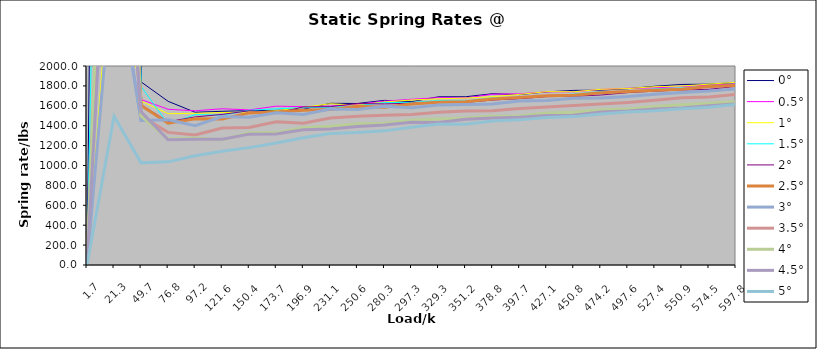
| Category | 0° | 0.5° | 1° | 1.5° | 2° | 2.5° | 3° | 3.5° | 4° | 4.5° | 5° |
|---|---|---|---|---|---|---|---|---|---|---|---|
| 1.7 | 0 | 0 | 0 | 0 | 0 | 0 | 0 | 0 | 0 | 0 | 0 |
| 21.3 | 23813.4 | 6905.294 | 3545.657 | 13416 | 6266.684 | 6583.778 | 3146 | 5723.095 | 7036.824 | 4968.889 | 1495.506 |
| 49.7 | 1839.887 | 1663.282 | 1647.75 | 1793.915 | 1611.419 | 1602.878 | 1451.547 | 1494.717 | 1497.425 | 1540.161 | 1026.527 |
| 76.8 | 1644.874 | 1564.777 | 1520.72 | 1415.34 | 1439.907 | 1424.976 | 1459.611 | 1332.616 | 1267.402 | 1258.618 | 1036.592 |
| 97.2 | 1534.881 | 1549.885 | 1524.137 | 1511.907 | 1488.355 | 1470.621 | 1400.381 | 1306.562 | 1277.526 | 1264.102 | 1097.731 |
| 121.6 | 1544.873 | 1570.464 | 1532.389 | 1506.026 | 1513.508 | 1466.937 | 1491.803 | 1375.837 | 1258.525 | 1265.052 | 1143.245 |
| 150.4 | 1551.173 | 1558.488 | 1536.215 | 1554.591 | 1550 | 1528.855 | 1485.711 | 1382.838 | 1329.329 | 1315.242 | 1179.759 |
| 173.7 | 1553.573 | 1596.497 | 1550.366 | 1570.014 | 1525.437 | 1537.468 | 1529.581 | 1439.971 | 1328.196 | 1316.789 | 1226.516 |
| 196.9 | 1565.677 | 1591.244 | 1584.096 | 1581.058 | 1588.778 | 1555.578 | 1511.999 | 1424.618 | 1379.631 | 1358.515 | 1277.896 |
| 231.1 | 1624.967 | 1597.653 | 1620.812 | 1586.332 | 1591.164 | 1561.994 | 1568.229 | 1476.985 | 1394.118 | 1366.715 | 1322.397 |
| 250.6 | 1623.238 | 1614.382 | 1606.396 | 1600.889 | 1623.09 | 1594.887 | 1564.071 | 1494.055 | 1419.647 | 1392.568 | 1330.774 |
| 280.3 | 1654.569 | 1646.562 | 1638.365 | 1633.18 | 1618.588 | 1584.71 | 1594.27 | 1505.339 | 1423.476 | 1408.191 | 1348.06 |
| 297.3 | 1642.201 | 1665.389 | 1658.348 | 1633.916 | 1626.329 | 1618.894 | 1581.522 | 1511.899 | 1455.709 | 1434.059 | 1384.388 |
| 329.3 | 1690.346 | 1682.096 | 1670.315 | 1650.917 | 1637.719 | 1636.675 | 1608.36 | 1535.017 | 1466.812 | 1433.379 | 1416.162 |
| 351.2 | 1690.963 | 1678.929 | 1677.481 | 1648.431 | 1633.819 | 1640.646 | 1613.708 | 1548.85 | 1477.327 | 1464.107 | 1414.994 |
| 378.8 | 1721.538 | 1715.926 | 1692.022 | 1679.231 | 1657.832 | 1669.021 | 1617.975 | 1551.163 | 1494.396 | 1476.685 | 1447.833 |
| 397.7 | 1712.745 | 1720.363 | 1714.637 | 1684.15 | 1671.585 | 1682.456 | 1648.291 | 1572.954 | 1496.69 | 1484.612 | 1458.561 |
| 427.1 | 1740.152 | 1739.969 | 1742.527 | 1701.496 | 1691.731 | 1699.808 | 1652.578 | 1586.995 | 1527.051 | 1502.224 | 1481.799 |
| 450.8 | 1754.855 | 1740.364 | 1741.052 | 1717.336 | 1696.289 | 1707.103 | 1675.14 | 1602.372 | 1535.887 | 1505.389 | 1491.22 |
| 474.2 | 1757.81 | 1764.679 | 1765.923 | 1743.064 | 1708.136 | 1732.21 | 1678.063 | 1617.351 | 1559.35 | 1537.492 | 1518.193 |
| 497.6 | 1771.71 | 1775.835 | 1773.172 | 1744.736 | 1732.278 | 1743.829 | 1692.338 | 1634.025 | 1567.528 | 1546.978 | 1537.48 |
| 527.4 | 1796.567 | 1780.179 | 1792.328 | 1770.556 | 1747.166 | 1755.28 | 1717.162 | 1656.553 | 1592.138 | 1568.662 | 1550.746 |
| 550.9 | 1814.691 | 1793.909 | 1798.564 | 1779.397 | 1759.008 | 1766.247 | 1734.034 | 1680.331 | 1611.51 | 1577.405 | 1570.81 |
| 574.5 | 1817.462 | 1806.578 | 1817.774 | 1795.435 | 1765.328 | 1793.252 | 1748.589 | 1689.631 | 1625.848 | 1601.745 | 1584.571 |
| 597.8 | 1833.078 | 1818.791 | 1836.191 | 1806.069 | 1795.187 | 1804.523 | 1769.821 | 1713.247 | 1640.299 | 1618.838 | 1615.008 |